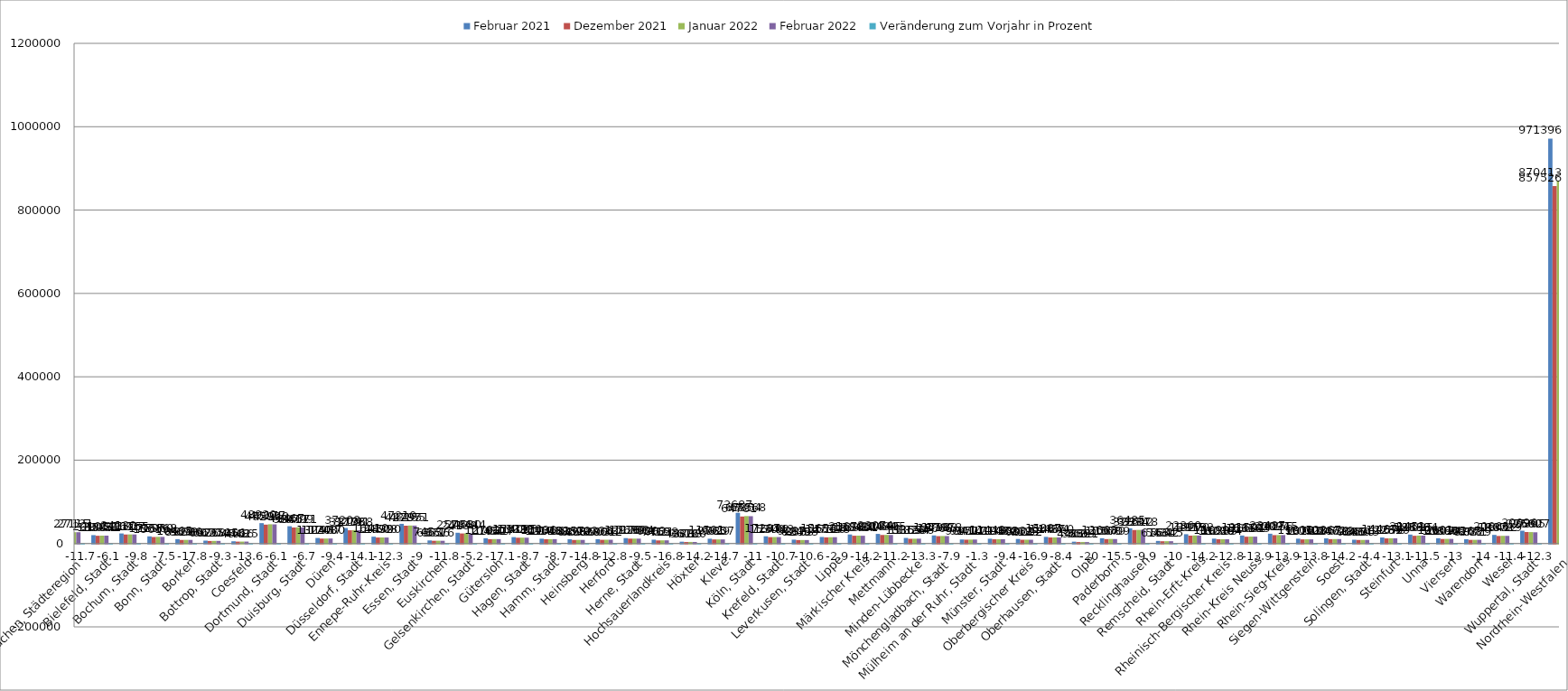
| Category | Februar 2021 | Dezember 2021 | Januar 2022 | Februar 2022 | Veränderung zum Vorjahr in Prozent |
|---|---|---|---|---|---|
| Aachen, Städteregion | 30705 | 26786 | 27115 | 27121 | -11.7 |
| Bielefeld, Stadt | 20105 | 18585 | 18952 | 18872 | -6.1 |
| Bochum, Stadt | 24130 | 21616 | 21817 | 21755 | -9.8 |
| Bonn, Stadt | 17157 | 15619 | 15960 | 15868 | -7.5 |
| Borken | 10465 | 8529 | 8698 | 8606 | -17.8 |
| Bottrop, Stadt | 6921 | 6070 | 6263 | 6274 | -9.3 |
| Coesfeld | 5356 | 4548 | 4616 | 4625 | -13.6 |
| Dortmund, Stadt | 48920 | 45299 | 46177 | 45940 | -6.1 |
| Duisburg, Stadt | 41467 | 38411 | 38799 | 38671 | -6.7 |
| Düren | 13247 | 11748 | 11937 | 12000 | -9.4 |
| Düsseldorf, Stadt | 37208 | 31778 | 32191 | 31968 | -14.1 |
| Ennepe-Ruhr-Kreis | 16410 | 14392 | 14508 | 14390 | -12.3 |
| Essen, Stadt | 47210 | 42737 | 43155 | 42951 | -9 |
| Euskirchen | 7453 | 6571 | 6656 | 6576 | -11.8 |
| Gelsenkirchen, Stadt | 25786 | 24138 | 24530 | 24444 | -5.2 |
| Gütersloh | 12702 | 10430 | 10630 | 10527 | -17.1 |
| Hagen, Stadt | 15311 | 13920 | 14095 | 13980 | -8.7 |
| Hamm, Stadt | 11486 | 10196 | 10406 | 10483 | -8.7 |
| Heinsberg | 10157 | 8493 | 8698 | 8656 | -14.8 |
| Herford | 10336 | 8864 | 9036 | 9012 | -12.8 |
| Herne, Stadt | 12926 | 11689 | 11763 | 11694 | -9.5 |
| Hochsauerlandkreis | 9203 | 7419 | 7621 | 7658 | -16.8 |
| Höxter | 4383 | 3612 | 3788 | 3760 | -14.2 |
| Kleve | 11501 | 9765 | 9829 | 9807 | -14.7 |
| Köln, Stadt | 73687 | 64781 | 65854 | 65568 | -11 |
| Krefeld, Stadt | 17287 | 15300 | 15492 | 15443 | -10.7 |
| Leverkusen, Stadt | 9287 | 8245 | 8363 | 8303 | -10.6 |
| Lippe | 15658 | 14759 | 15116 | 15198 | -2.9 |
| Märkischer Kreis | 21678 | 18648 | 18864 | 18601 | -14.2 |
| Mettmann | 23074 | 20484 | 20685 | 20495 | -11.2 |
| Minden-Lübbecke | 13365 | 11326 | 11554 | 11588 | -13.3 |
| Mönchengladbach, Stadt | 19418 | 17668 | 17983 | 17878 | -7.9 |
| Mülheim an der Ruhr, Stadt | 9641 | 9177 | 9414 | 9517 | -1.3 |
| Münster, Stadt | 11448 | 10148 | 10333 | 10372 | -9.4 |
| Oberbergischer Kreis | 10832 | 9021 | 9125 | 9002 | -16.9 |
| Oberhausen, Stadt | 15887 | 14487 | 14644 | 14560 | -8.4 |
| Olpe | 4402 | 3536 | 3609 | 3521 | -20 |
| Paderborn | 12668 | 10568 | 10879 | 10709 | -15.5 |
| Recklinghausen | 36485 | 32334 | 32612 | 32878 | -9.9 |
| Remscheid, Stadt | 6163 | 5431 | 5542 | 5545 | -10 |
| Rhein-Erft-Kreis | 22360 | 18915 | 19270 | 19192 | -14.2 |
| Rheinisch-Bergischer Kreis | 11699 | 10236 | 10385 | 10204 | -12.8 |
| Rhein-Kreis Neuss | 19159 | 16313 | 16601 | 16503 | -13.9 |
| Rhein-Sieg-Kreis | 23487 | 20094 | 20255 | 20215 | -13.9 |
| Siegen-Wittgenstein | 11606 | 9877 | 10103 | 10008 | -13.8 |
| Soest | 12367 | 10472 | 10633 | 10613 | -14.2 |
| Solingen, Stadt | 9045 | 8480 | 8600 | 8643 | -4.4 |
| Steinfurt | 14467 | 12281 | 12578 | 12569 | -13.1 |
| Unna | 21451 | 18536 | 19025 | 18984 | -11.5 |
| Viersen | 12601 | 10860 | 11074 | 10965 | -13 |
| Warendorf | 10267 | 8703 | 8771 | 8829 | -14 |
| Wesel | 20666 | 18072 | 18412 | 18319 | -11.4 |
| Wuppertal, Stadt | 30696 | 27560 | 27395 | 26927 | -12.3 |
| Nordrhein-Westfalen | 971396 | 857526 | 870413 | 866784 | -10.8 |